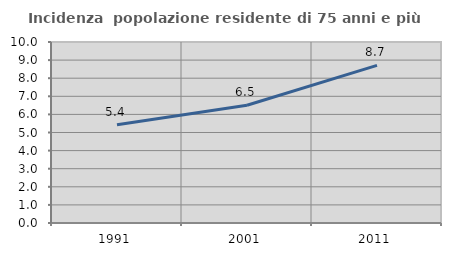
| Category | Incidenza  popolazione residente di 75 anni e più |
|---|---|
| 1991.0 | 5.426 |
| 2001.0 | 6.506 |
| 2011.0 | 8.707 |